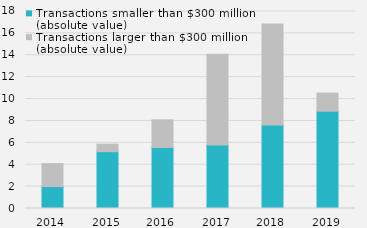
| Category | Transactions smaller than $300 million (absolute value) | Transactions larger than $300 million (absolute value) |
|---|---|---|
| 2014.0 | 2003656 | 2091981 |
| 2015.0 | 5191989 | 688272 |
| 2016.0 | 5575646.84 | 2522521 |
| 2017.0 | 5794548 | 8310435 |
| 2018.0 | 7620515 | 9244919 |
| 2019.0 | 8890062 | 1658699 |